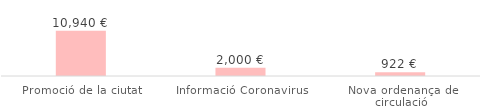
| Category | Total |
|---|---|
| Promoció de la ciutat | 10940.44 |
| Informació Coronavirus | 2000 |
| Nova ordenança de circulació | 922.02 |